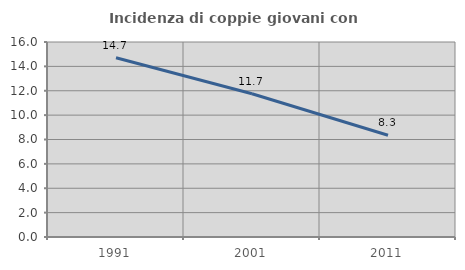
| Category | Incidenza di coppie giovani con figli |
|---|---|
| 1991.0 | 14.712 |
| 2001.0 | 11.749 |
| 2011.0 | 8.349 |